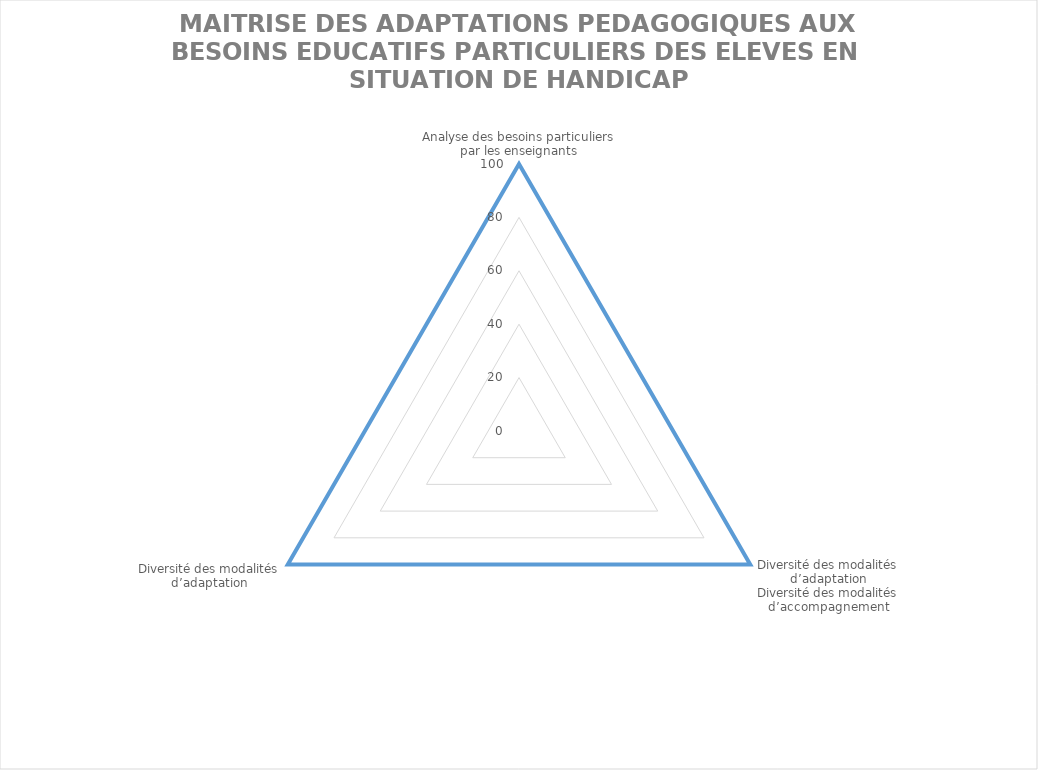
| Category | Series 0 |
|---|---|
| Analyse des besoins particuliers par les enseignants | 100 |
| Diversité des modalités d’adaptation
Diversité des modalités d’accompagnement | 100 |
| Diversité des modalités d’adaptation
 | 100 |